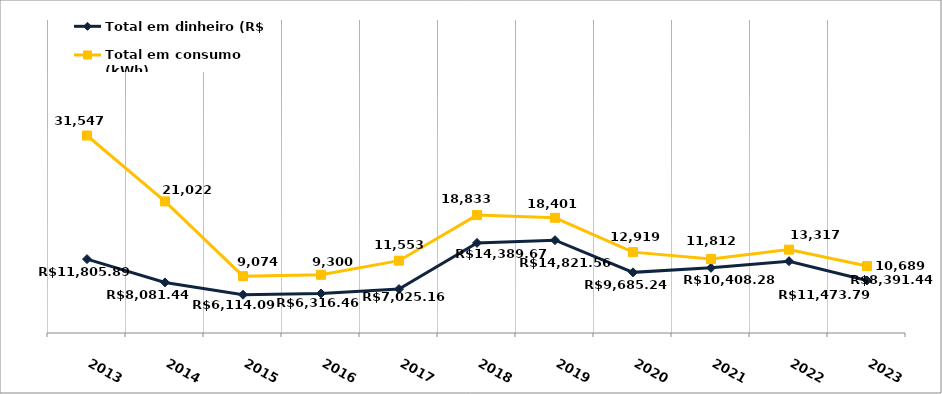
| Category | Total em dinheiro (R$) |
|---|---|
| 2013.0 | 11805.89 |
| 2014.0 | 8081.44 |
| 2015.0 | 6114.09 |
| 2016.0 | 6316.46 |
| 2017.0 | 7025.16 |
| 2018.0 | 14389.67 |
| 2019.0 | 14821.56 |
| 2020.0 | 9685.24 |
| 2021.0 | 10408.28 |
| 2022.0 | 11473.79 |
| 2023.0 | 8391.44 |